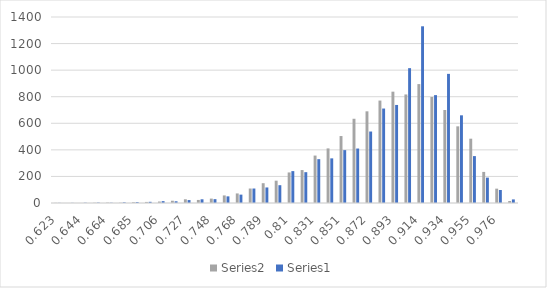
| Category | Series 2 | Series 0 |
|---|---|---|
| 0.623 | 1 | 1 |
| 0.633 | 0 | 1 |
| 0.644 | 0 | 2 |
| 0.654 | 2 | 3 |
| 0.664 | 3 | 2 |
| 0.675 | 2 | 5 |
| 0.685 | 6 | 7 |
| 0.696 | 8 | 9 |
| 0.706 | 11 | 14 |
| 0.716 | 17 | 13 |
| 0.727 | 28 | 22 |
| 0.737 | 23 | 28 |
| 0.748 | 33 | 29 |
| 0.758 | 57 | 50 |
| 0.768 | 72 | 63 |
| 0.779 | 109 | 109 |
| 0.789 | 149 | 117 |
| 0.799 | 168 | 134 |
| 0.81 | 230 | 240 |
| 0.82 | 248 | 232 |
| 0.831 | 357 | 330 |
| 0.841 | 411 | 336 |
| 0.851 | 504 | 398 |
| 0.862 | 634 | 410 |
| 0.872 | 690 | 538 |
| 0.883 | 771 | 711 |
| 0.893 | 838 | 738 |
| 0.903 | 817 | 1015 |
| 0.914 | 895 | 1330 |
| 0.924 | 798 | 812 |
| 0.934 | 700 | 972 |
| 0.945 | 577 | 660 |
| 0.955 | 484 | 353 |
| 0.966 | 234 | 191 |
| 0.976 | 108 | 98 |
| 0.986 | 15 | 27 |